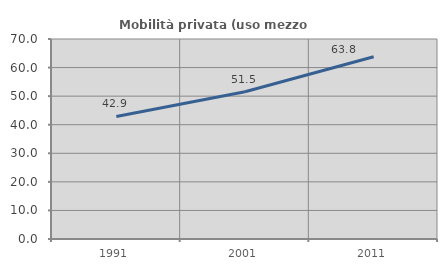
| Category | Mobilità privata (uso mezzo privato) |
|---|---|
| 1991.0 | 42.905 |
| 2001.0 | 51.524 |
| 2011.0 | 63.802 |